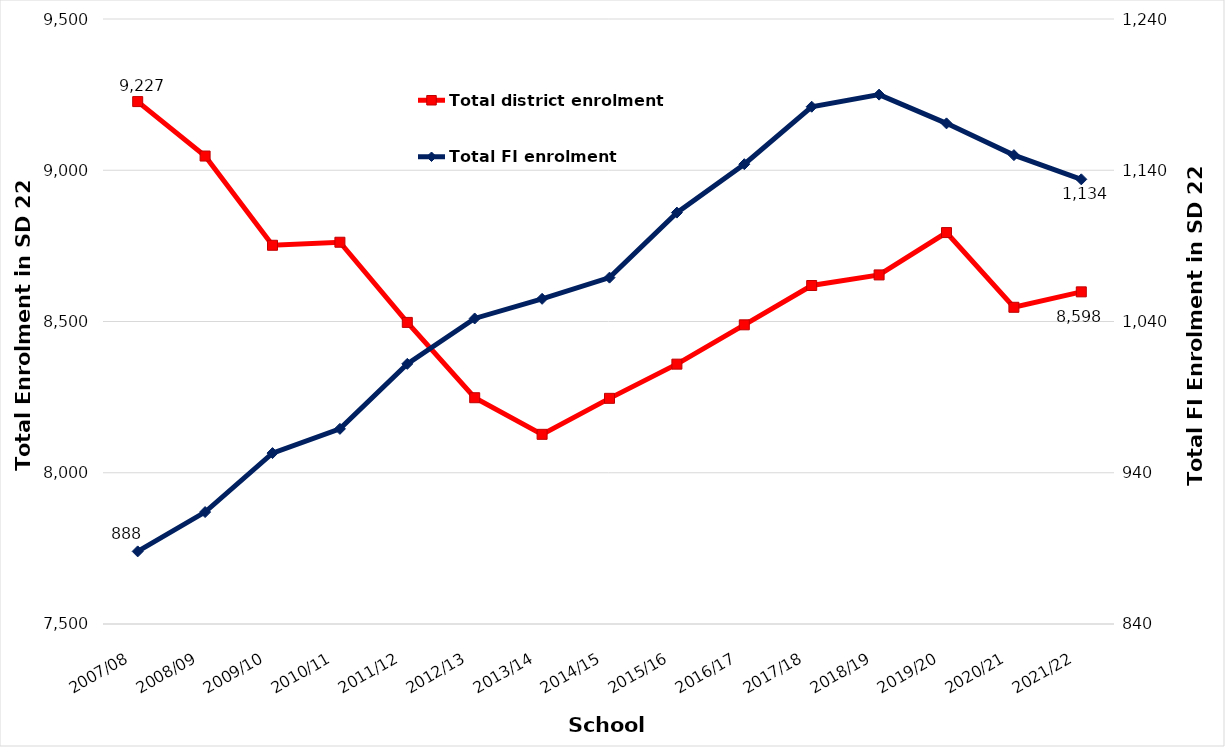
| Category | Total district enrolment  |
|---|---|
| 2007/08 | 9227 |
| 2008/09 | 9047 |
| 2009/10 | 8752 |
| 2010/11 | 8762 |
| 2011/12 | 8497 |
| 2012/13 | 8248 |
| 2013/14 | 8127 |
| 2014/15 | 8246 |
| 2015/16 | 8359 |
| 2016/17 | 8489 |
| 2017/18 | 8619 |
| 2018/19 | 8654 |
| 2019/20 | 8794 |
| 2020/21 | 8547 |
| 2021/22 | 8598 |